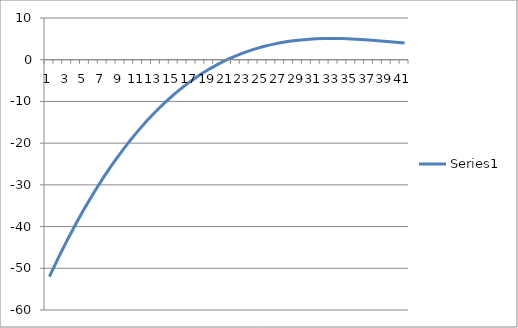
| Category | Series 0 |
|---|---|
| 0 | -52 |
| 1 | -47.519 |
| 2 | -43.272 |
| 3 | -39.253 |
| 4 | -35.456 |
| 5 | -31.875 |
| 6 | -28.504 |
| 7 | -25.337 |
| 8 | -22.368 |
| 9 | -19.591 |
| 10 | -17 |
| 11 | -14.589 |
| 12 | -12.352 |
| 13 | -10.283 |
| 14 | -8.376 |
| 15 | -6.625 |
| 16 | -5.024 |
| 17 | -3.567 |
| 18 | -2.248 |
| 19 | -1.061 |
| 20 | 0 |
| 21 | 0.941 |
| 22 | 1.768 |
| 23 | 2.487 |
| 24 | 3.104 |
| 25 | 3.625 |
| 26 | 4.056 |
| 27 | 4.403 |
| 28 | 4.672 |
| 29 | 4.869 |
| 30 | 5 |
| 31 | 5.071 |
| 32 | 5.088 |
| 33 | 5.057 |
| 34 | 4.984 |
| 35 | 4.875 |
| 36 | 4.736 |
| 37 | 4.573 |
| 38 | 4.392 |
| 39 | 4.199 |
| 40 | 4 |